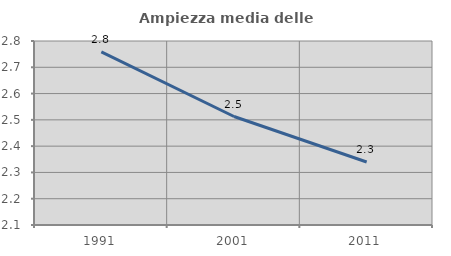
| Category | Ampiezza media delle famiglie |
|---|---|
| 1991.0 | 2.758 |
| 2001.0 | 2.513 |
| 2011.0 | 2.34 |